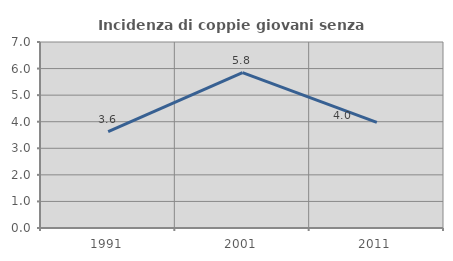
| Category | Incidenza di coppie giovani senza figli |
|---|---|
| 1991.0 | 3.625 |
| 2001.0 | 5.846 |
| 2011.0 | 3.974 |